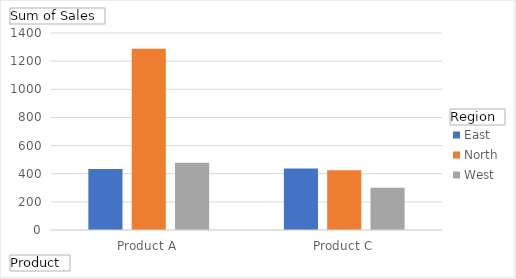
| Category | East | North | West |
|---|---|---|---|
| Product A | 433 | 1288 | 478 |
| Product C | 437 | 424 | 301 |